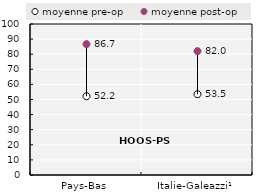
| Category | moyenne pre-op | moyenne post-op |
|---|---|---|
| Pays-Bas | 52.169 | 86.665 |
| Italie-Galeazzi¹ | 53.51 | 82.03 |